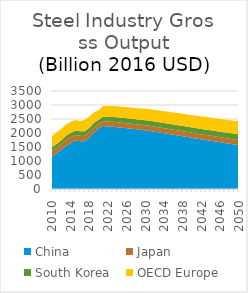
| Category | China | Japan | South Korea | OECD Europe |
|---|---|---|---|---|
| 2010.0 | 1162.402 | 210.791 | 125.458 | 391.776 |
| 2011.0 | 1273.392 | 194.726 | 135.509 | 427.122 |
| 2012.0 | 1395.221 | 208.734 | 137.331 | 410.947 |
| 2013.0 | 1539.77 | 220.504 | 140.82 | 399.229 |
| 2014.0 | 1641.764 | 215.189 | 152.327 | 395.476 |
| 2015.0 | 1730.908 | 193.732 | 154.796 | 382.441 |
| 2016.0 | 1702.004 | 200.727 | 159.475 | 363.721 |
| 2017.0 | 1705.779 | 190.122 | 164.767 | 410.203 |
| 2018.0 | 1836.228 | 186.322 | 162.149 | 401.118 |
| 2019.0 | 2019.518 | 181.114 | 161.252 | 375.539 |
| 2020.0 | 2171.569 | 155.068 | 147.409 | 346.038 |
| 2021.0 | 2252.163 | 174.911 | 161.559 | 386.143 |
| 2022.0 | 2227.842 | 178.268 | 165.02 | 391.428 |
| 2023.0 | 2220.315 | 180.284 | 169.681 | 395.211 |
| 2024.0 | 2205.754 | 180.761 | 171.908 | 397.087 |
| 2025.0 | 2187.779 | 181.54 | 173.378 | 398.75 |
| 2026.0 | 2169.456 | 182.085 | 174.436 | 400.408 |
| 2027.0 | 2150.765 | 182.065 | 175.506 | 401.816 |
| 2028.0 | 2131.951 | 181.933 | 176.724 | 403.419 |
| 2029.0 | 2113.209 | 181.815 | 178.041 | 405.555 |
| 2030.0 | 2093.51 | 181.67 | 179.496 | 408.109 |
| 2031.0 | 2071.138 | 181.555 | 181.254 | 412.034 |
| 2032.0 | 2045.241 | 181.422 | 182.18 | 415.984 |
| 2033.0 | 2018.072 | 181.443 | 182.966 | 419.891 |
| 2034.0 | 1990.814 | 181.394 | 184.005 | 423.916 |
| 2035.0 | 1963.908 | 181.163 | 185.29 | 427.679 |
| 2036.0 | 1936.958 | 180.702 | 186.506 | 431.086 |
| 2037.0 | 1909.013 | 180.157 | 187.516 | 434.296 |
| 2038.0 | 1880.919 | 179.693 | 188.425 | 437.141 |
| 2039.0 | 1853.016 | 179.454 | 189.509 | 439.687 |
| 2040.0 | 1825.493 | 179.197 | 190.821 | 441.944 |
| 2041.0 | 1798.249 | 179.034 | 192.417 | 444.005 |
| 2042.0 | 1771.777 | 178.892 | 194.053 | 446.094 |
| 2043.0 | 1745.905 | 178.708 | 195.564 | 448.381 |
| 2044.0 | 1719.93 | 178.54 | 196.993 | 450.893 |
| 2045.0 | 1694.035 | 178.423 | 198.329 | 453.668 |
| 2046.0 | 1668.097 | 178.32 | 199.529 | 456.721 |
| 2047.0 | 1641.899 | 178.206 | 200.704 | 460.097 |
| 2048.0 | 1615.864 | 178.119 | 201.986 | 463.755 |
| 2049.0 | 1590.005 | 178.024 | 203.353 | 467.581 |
| 2050.0 | 1564.244 | 177.925 | 204.876 | 471.375 |